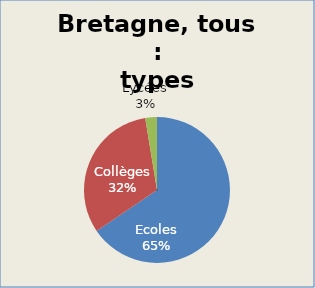
| Category | Tous |
|---|---|
| Ecoles | 659 |
| Collèges | 321 |
| Lycées | 26 |